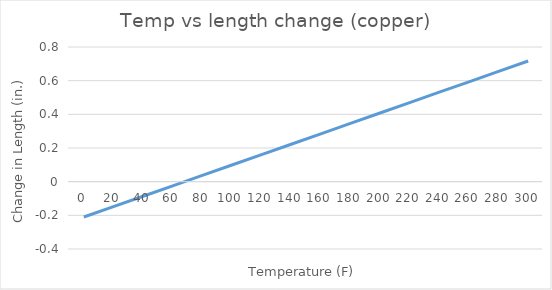
| Category | Temp vs length change |
|---|---|
| 0.0 | -0.21 |
| 20.0 | -0.148 |
| 40.0 | -0.087 |
| 60.0 | -0.025 |
| 80.0 | 0.037 |
| 100.0 | 0.099 |
| 120.0 | 0.161 |
| 140.0 | 0.222 |
| 160.0 | 0.284 |
| 180.0 | 0.346 |
| 200.0 | 0.408 |
| 220.0 | 0.47 |
| 240.0 | 0.531 |
| 260.0 | 0.593 |
| 280.0 | 0.655 |
| 300.0 | 0.717 |